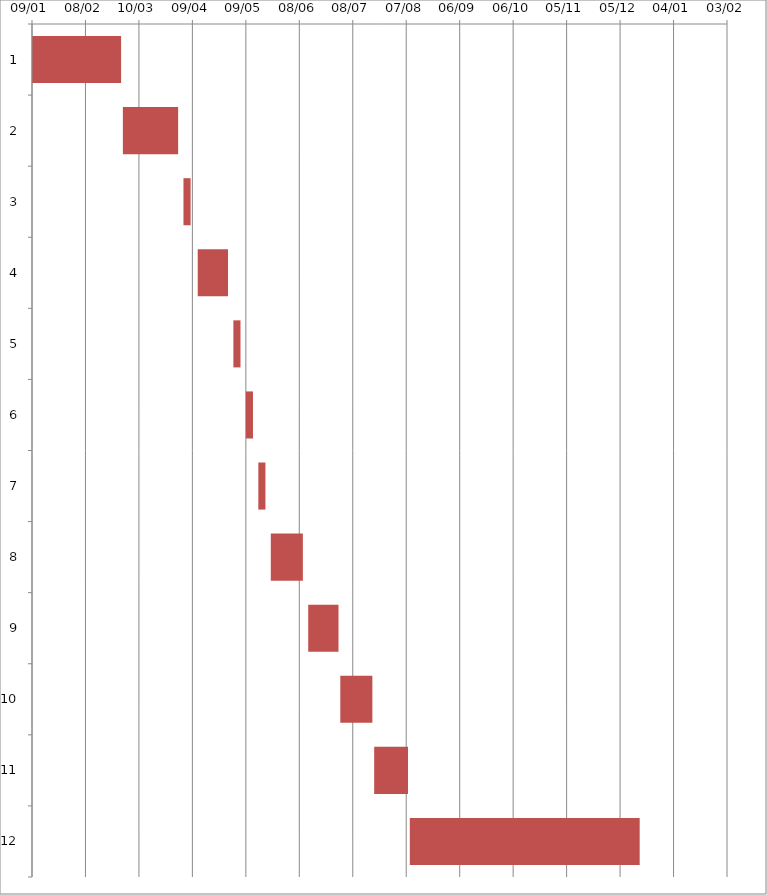
| Category | Fecha de inicio | DURACIÓN |
|---|---|---|
| 0 | 1/9/17 | 50 |
| 1 | 3/1/17 | 31 |
| 2 | 4/4/17 | 4 |
| 3 | 4/12/17 | 17 |
| 4 | 5/2/17 | 4 |
| 5 | 5/9/17 | 4 |
| 6 | 5/16/17 | 4 |
| 7 | 5/23/17 | 18 |
| 8 | 6/13/17 | 17 |
| 9 | 7/1/17 | 18 |
| 10 | 7/20/17 | 19 |
| 11 | 8/9/17 | 129 |